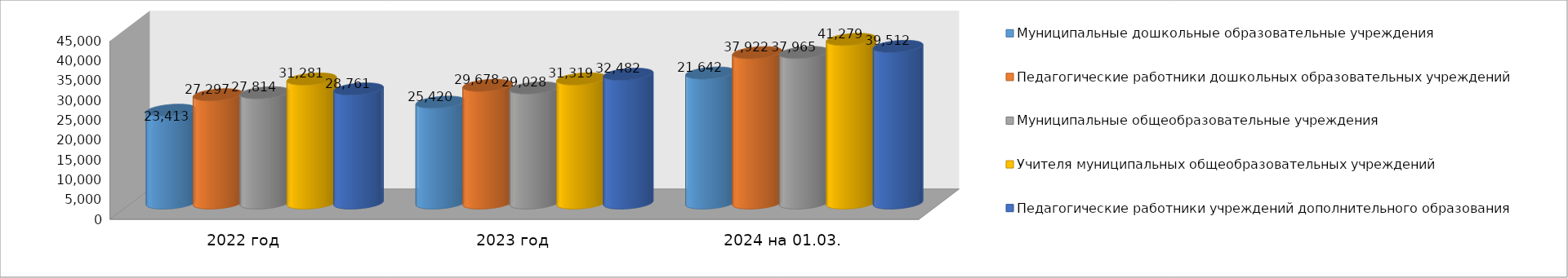
| Category | Муниципальные дошкольные образовательные учреждения | Педагогические работники дошкольных образовательных учреждений | Муниципальные общеобразовательные учреждения | Учителя муниципальных общеобразовательных учреждений | Педагогические работники учреждений дополнительного образования |
|---|---|---|---|---|---|
| 2022 год | 23413 | 27297 | 27814 | 31281 | 28761 |
| 2023 год | 25420 | 29678 | 29028 | 31319 | 32482 |
| 2024 на 01.03. | 32787 | 37922 | 37965 | 41279 | 39512 |